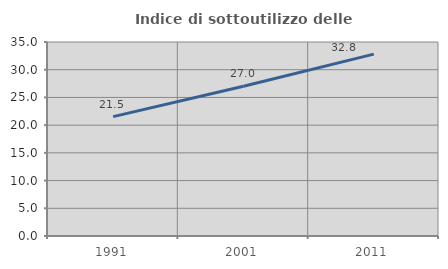
| Category | Indice di sottoutilizzo delle abitazioni  |
|---|---|
| 1991.0 | 21.534 |
| 2001.0 | 27.008 |
| 2011.0 | 32.814 |